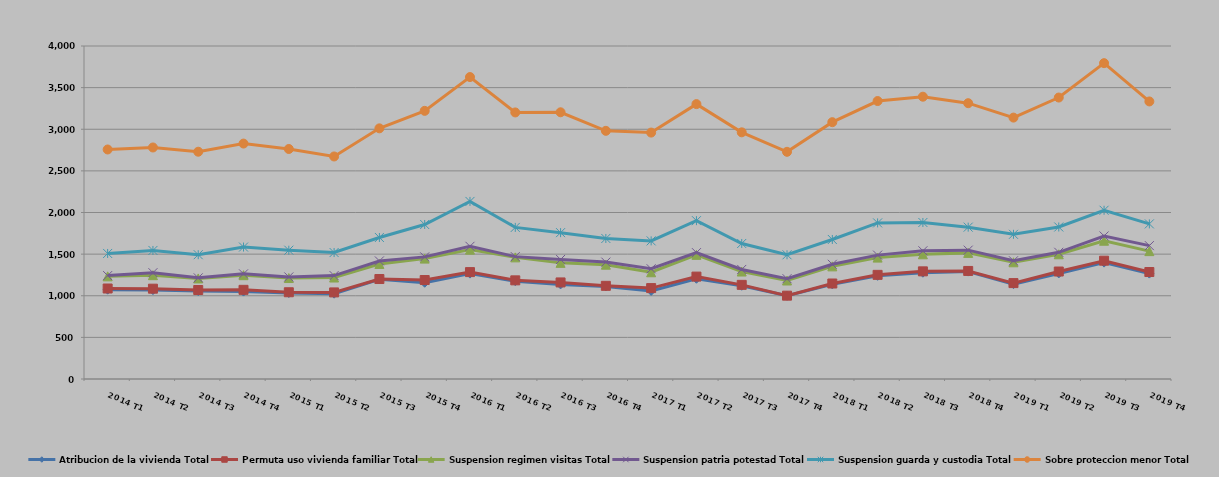
| Category | Atribucion de la vivienda Total | Permuta uso vivienda familiar Total | Suspension regimen visitas Total | Suspension patria potestad Total | Suspension guarda y custodia Total | Sobre proteccion menor Total |
|---|---|---|---|---|---|---|
| 2014 T1 | 1073 | 14 | 146 | 9 | 266 | 1249 |
| 2014 T2 | 1068 | 17 | 162 | 30 | 267 | 1237 |
| 2014 T3 | 1056 | 13 | 139 | 7 | 278 | 1237 |
| 2014 T4 | 1050 | 21 | 176 | 16 | 322 | 1243 |
| 2015 T1 | 1033 | 9 | 171 | 13 | 321 | 1216 |
| 2015 T2 | 1025 | 15 | 179 | 23 | 277 | 1154 |
| 2015 T3 | 1198 | 3 | 181 | 36 | 282 | 1311 |
| 2015 T4 | 1156 | 33 | 257 | 21 | 389 | 1365 |
| 2016 T1 | 1266 | 18 | 270 | 40 | 539 | 1494 |
| 2016 T2 | 1175 | 10 | 276 | 9 | 351 | 1381 |
| 2016 T3 | 1136 | 24 | 235 | 41 | 322 | 1446 |
| 2016 T4 | 1112 | 7 | 254 | 31 | 284 | 1293 |
| 2017 T1 | 1058 | 34 | 190 | 42 | 335 | 1301 |
| 2017 T2 | 1204 | 26 | 261 | 27 | 384 | 1400 |
| 2017 T3 | 1120 | 11 | 160 | 25 | 312 | 1335 |
| 2017 T4 | 1000 | 1 | 182 | 22 | 287 | 1237 |
| 2018 T1 | 1137 | 10 | 206 | 25 | 298 | 1409 |
| 2018 T2 | 1239 | 12 | 207 | 30 | 387 | 1464 |
| 2018 T3 | 1277 | 16 | 205 | 42 | 340 | 1511 |
| 2018 T4 | 1290 | 8 | 217 | 33 | 276 | 1489 |
| 2019 T1 | 1139 | 13 | 250 | 18 | 318 | 1402 |
| 2019 T2 | 1268 | 23 | 207 | 24 | 304 | 1555 |
| 2019 T3 | 1398 | 23 | 240 | 57 | 309 | 1767 |
| 2019 T4 | 1266 | 19 | 251 | 66 | 261 | 1471 |